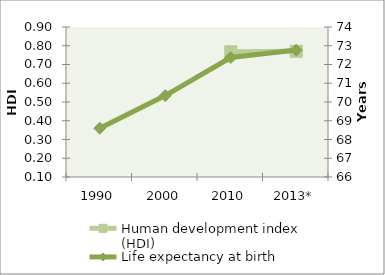
| Category | Human development index (HDI) |
|---|---|
| 1990 | 0 |
| 2000 | 0 |
| 2010 | 0.768 |
| 2013* | 0.77 |